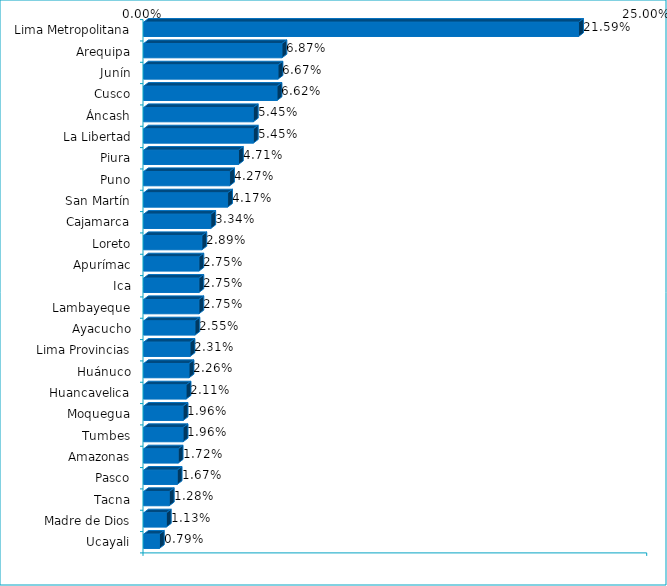
| Category | Series 0 |
|---|---|
| Lima Metropolitana | 0.216 |
| Arequipa | 0.069 |
| Junín | 0.067 |
| Cusco | 0.066 |
| Áncash | 0.054 |
| La Libertad | 0.054 |
| Piura | 0.047 |
| Puno | 0.043 |
| San Martín | 0.042 |
| Cajamarca | 0.033 |
| Loreto | 0.029 |
| Apurímac | 0.027 |
| Ica | 0.027 |
| Lambayeque | 0.027 |
| Ayacucho | 0.026 |
| Lima Provincias | 0.023 |
| Huánuco | 0.023 |
| Huancavelica | 0.021 |
| Moquegua | 0.02 |
| Tumbes | 0.02 |
| Amazonas | 0.017 |
| Pasco | 0.017 |
| Tacna | 0.013 |
| Madre de Dios | 0.011 |
| Ucayali | 0.008 |